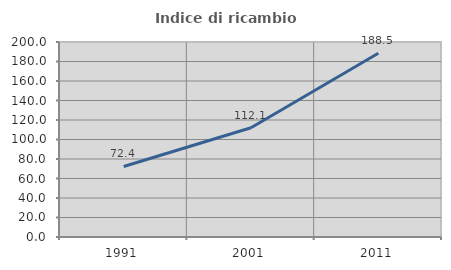
| Category | Indice di ricambio occupazionale  |
|---|---|
| 1991.0 | 72.352 |
| 2001.0 | 112.083 |
| 2011.0 | 188.537 |